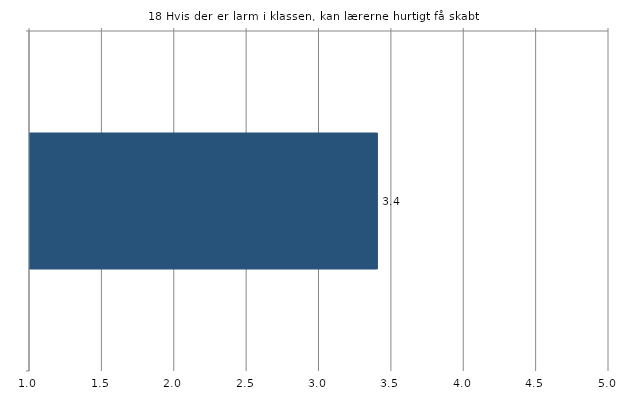
| Category | Gns. |
|---|---|
|    | 3.4 |